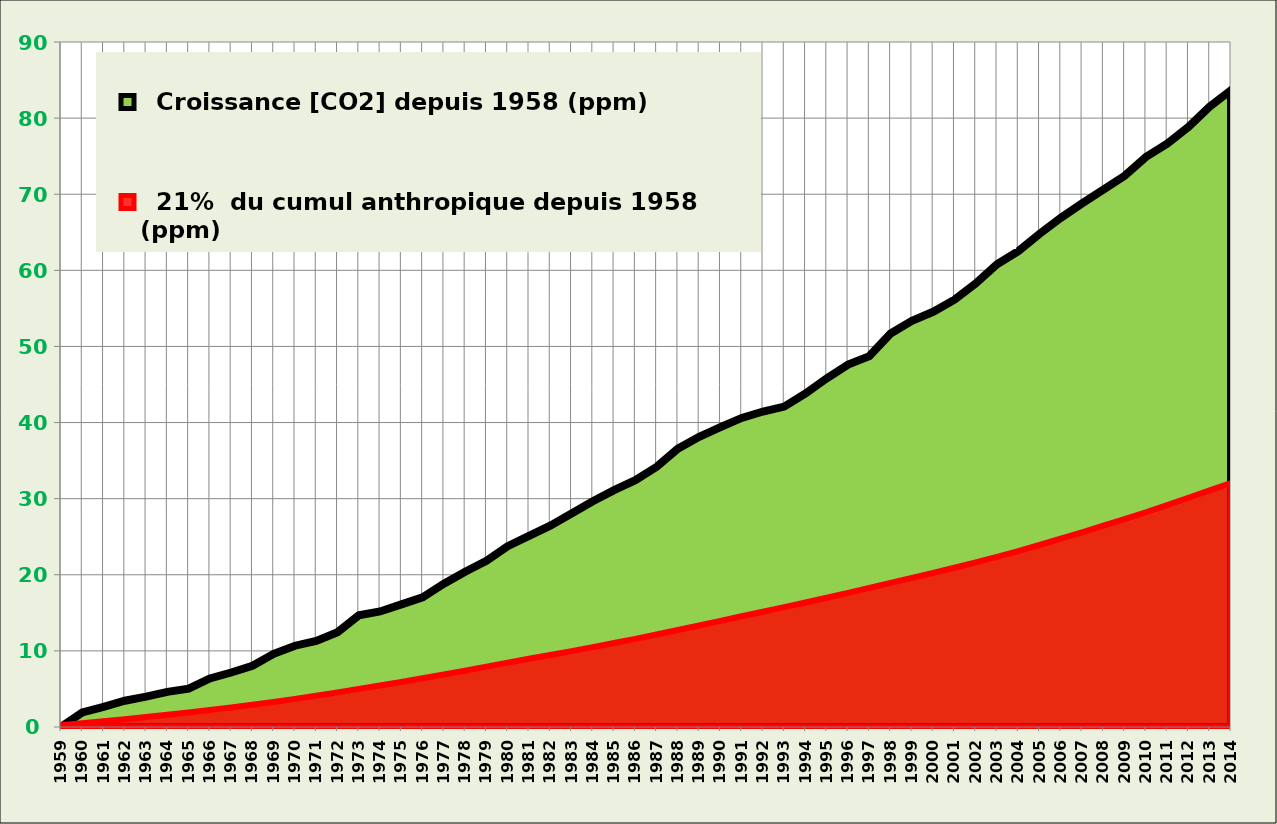
| Category |   Croissance [CO2] depuis 1958 (ppm) |   21%  du cumul anthropique depuis 1958 (ppm) |
|---|---|---|
| 1959.0 | 0 | 0.243 |
| 1960.0 | 1.91 | 0.498 |
| 1961.0 | 2.64 | 0.753 |
| 1962.0 | 3.45 | 1.019 |
| 1963.0 | 3.99 | 1.3 |
| 1964.0 | 4.62 | 1.596 |
| 1965.0 | 5.04 | 1.907 |
| 1966.0 | 6.38 | 2.232 |
| 1967.0 | 7.16 | 2.568 |
| 1968.0 | 8.04 | 2.922 |
| 1969.0 | 9.62 | 3.296 |
| 1970.0 | 10.68 | 3.697 |
| 1971.0 | 11.32 | 4.114 |
| 1972.0 | 12.45 | 4.548 |
| 1973.0 | 14.68 | 5.005 |
| 1974.0 | 15.18 | 5.463 |
| 1975.0 | 16.11 | 5.918 |
| 1976.0 | 17.04 | 6.4 |
| 1977.0 | 18.83 | 6.897 |
| 1978.0 | 20.4 | 7.399 |
| 1979.0 | 21.84 | 7.93 |
| 1980.0 | 23.75 | 8.455 |
| 1981.0 | 25.11 | 8.964 |
| 1982.0 | 26.45 | 9.469 |
| 1983.0 | 28.05 | 9.971 |
| 1984.0 | 29.65 | 10.492 |
| 1985.0 | 31.12 | 11.029 |
| 1986.0 | 32.42 | 11.582 |
| 1987.0 | 34.19 | 12.149 |
| 1988.0 | 36.57 | 12.737 |
| 1989.0 | 38.12 | 13.338 |
| 1990.0 | 39.39 | 13.939 |
| 1991.0 | 40.61 | 14.548 |
| 1992.0 | 41.45 | 15.15 |
| 1993.0 | 42.1 | 15.751 |
| 1994.0 | 43.83 | 16.363 |
| 1995.0 | 45.82 | 16.987 |
| 1996.0 | 47.61 | 17.626 |
| 1997.0 | 48.73 | 18.275 |
| 1998.0 | 51.7 | 18.927 |
| 1999.0 | 53.38 | 19.577 |
| 2000.0 | 54.55 | 20.244 |
| 2001.0 | 56.14 | 20.927 |
| 2002.0 | 58.28 | 21.619 |
| 2003.0 | 60.8 | 22.35 |
| 2004.0 | 62.52 | 23.117 |
| 2005.0 | 64.8 | 23.914 |
| 2006.0 | 66.9 | 24.739 |
| 2007.0 | 68.79 | 25.582 |
| 2008.0 | 70.6 | 26.451 |
| 2009.0 | 72.43 | 27.312 |
| 2010.0 | 74.9 | 28.217 |
| 2011.0 | 76.65 | 29.158 |
| 2012.0 | 78.85 | 30.116 |
| 2013.0 | 81.52 | 31.084 |
| 2014.0 | 83.65 | 32.06 |